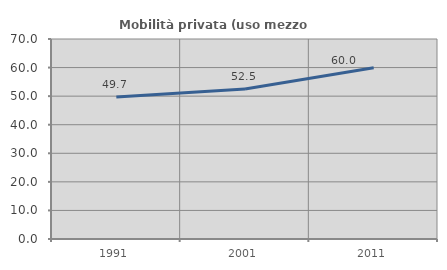
| Category | Mobilità privata (uso mezzo privato) |
|---|---|
| 1991.0 | 49.693 |
| 2001.0 | 52.518 |
| 2011.0 | 59.953 |